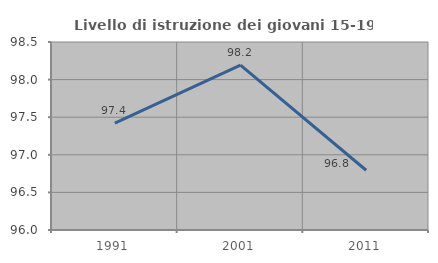
| Category | Livello di istruzione dei giovani 15-19 anni |
|---|---|
| 1991.0 | 97.423 |
| 2001.0 | 98.193 |
| 2011.0 | 96.795 |